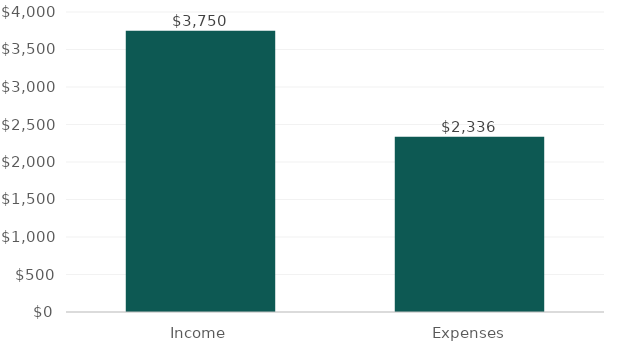
| Category | ChartData |
|---|---|
| 0 | 3750 |
| 1 | 2336 |